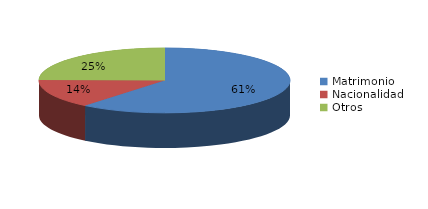
| Category | Series 0 |
|---|---|
| Matrimonio | 619 |
| Nacionalidad | 146 |
| Otros | 252 |